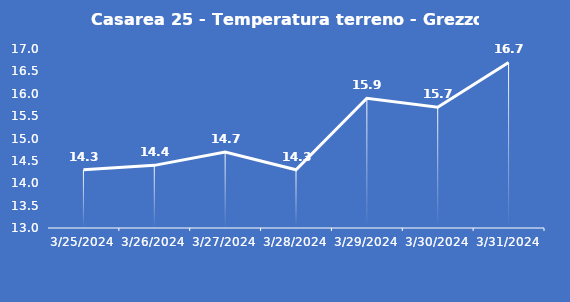
| Category | Casarea 25 - Temperatura terreno - Grezzo (°C) |
|---|---|
| 3/25/24 | 14.3 |
| 3/26/24 | 14.4 |
| 3/27/24 | 14.7 |
| 3/28/24 | 14.3 |
| 3/29/24 | 15.9 |
| 3/30/24 | 15.7 |
| 3/31/24 | 16.7 |